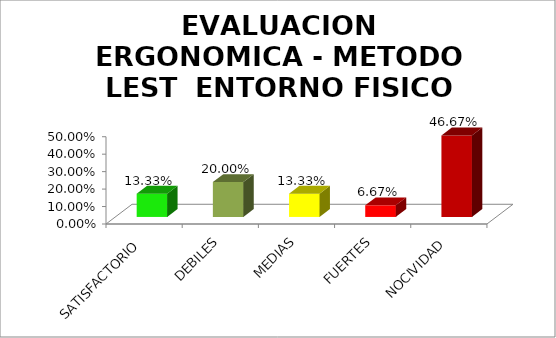
| Category | EVALUACION ERGONOMICA - METODO LEST  |
|---|---|
| SATISFACTORIO | 0.133 |
| DEBILES | 0.2 |
| MEDIAS | 0.133 |
| FUERTES | 0.067 |
| NOCIVIDAD | 0.467 |